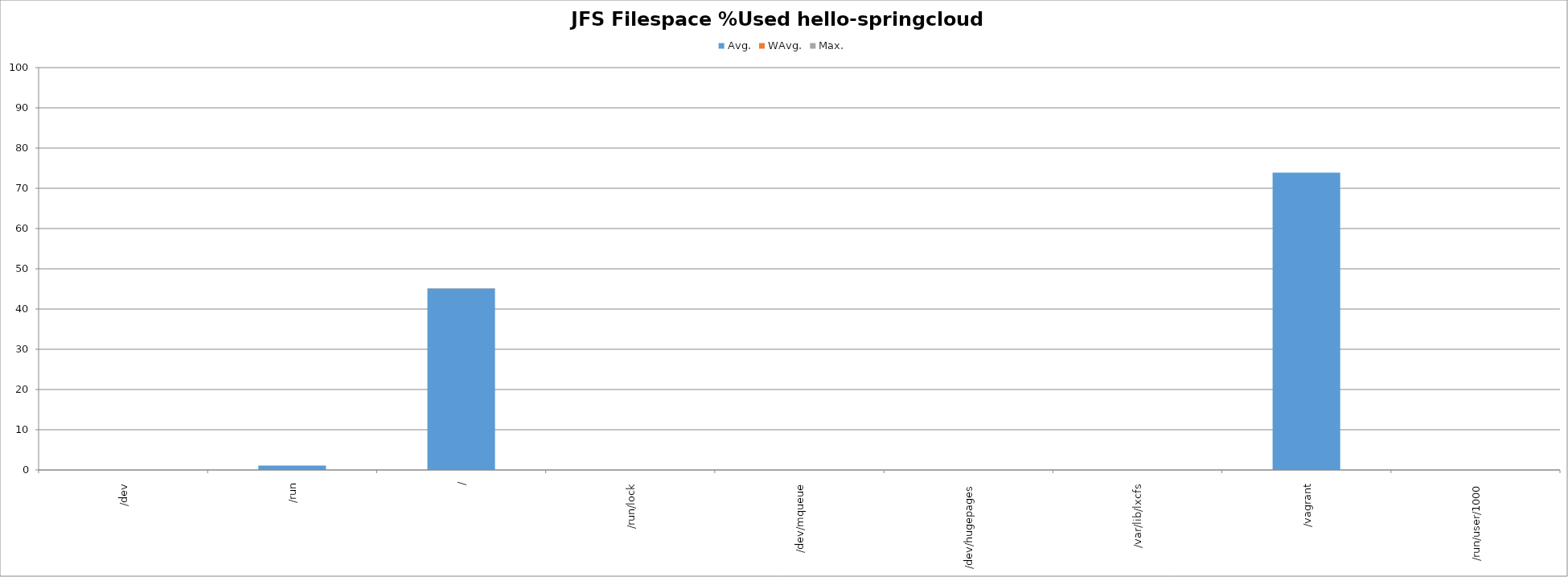
| Category | Avg. | WAvg. | Max. |
|---|---|---|---|
| /dev | 0 | 0 | 0 |
| /run | 1.1 | 0 | 0 |
| / | 45.082 | 0 | 0.117 |
| /run/lock | 0 | 0 | 0 |
| /dev/mqueue | 0 | 0 | 0 |
| /dev/hugepages | 0 | 0 | 0 |
| /var/lib/lxcfs | 0 | 0 | 0 |
| /vagrant | 73.9 | 0 | 0 |
| /run/user/1000 | 0 | 0 | 0 |